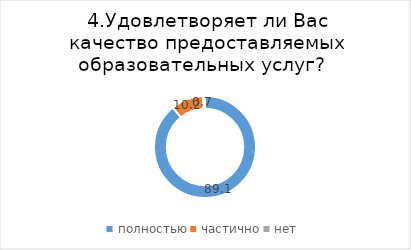
| Category | Series 0 |
|---|---|
| полностью | 89.145 |
| частично | 10.197 |
| нет | 0.658 |